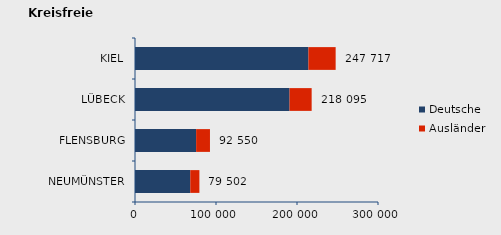
| Category | Deutsche | Ausländer | Series 2 |
|---|---|---|---|
| NEUMÜNSTER | 68251 | 11251 | 79502 |
| FLENSBURG | 75465 | 17085 | 92550 |
| LÜBECK | 190794 | 27301 | 218095 |
| KIEL | 214099 | 33618 | 247717 |